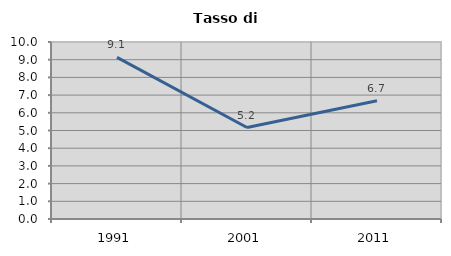
| Category | Tasso di disoccupazione   |
|---|---|
| 1991.0 | 9.132 |
| 2001.0 | 5.169 |
| 2011.0 | 6.676 |